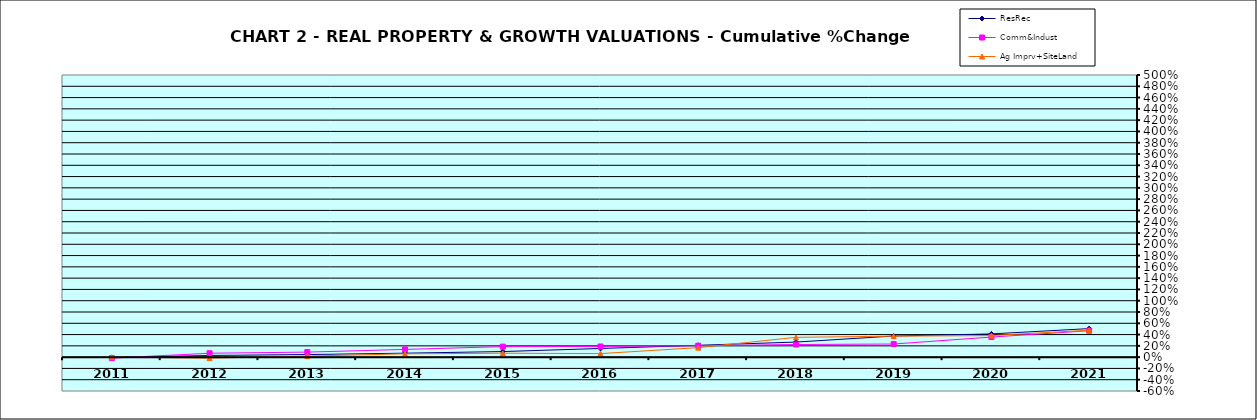
| Category | ResRec | Comm&Indust | Ag Imprv+SiteLand |
|---|---|---|---|
| 2011.0 | -0.007 | -0.018 | 0 |
| 2012.0 | 0.03 | 0.069 | -0.018 |
| 2013.0 | 0.046 | 0.089 | 0.019 |
| 2014.0 | 0.07 | 0.137 | 0.059 |
| 2015.0 | 0.099 | 0.187 | 0.07 |
| 2016.0 | 0.154 | 0.189 | 0.063 |
| 2017.0 | 0.21 | 0.203 | 0.169 |
| 2018.0 | 0.267 | 0.224 | 0.351 |
| 2019.0 | 0.374 | 0.232 | 0.372 |
| 2020.0 | 0.412 | 0.356 | 0.382 |
| 2021.0 | 0.506 | 0.468 | 0.477 |